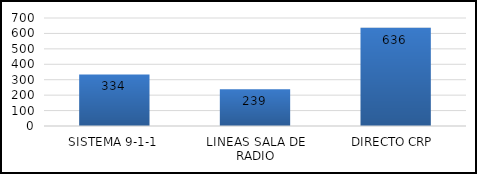
| Category | TOTAL |
|---|---|
| SISTEMA 9-1-1 | 334 |
| LINEAS SALA DE RADIO | 239 |
| DIRECTO CRP  | 636 |